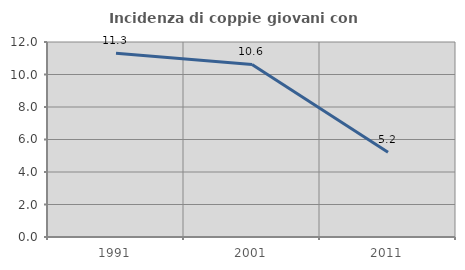
| Category | Incidenza di coppie giovani con figli |
|---|---|
| 1991.0 | 11.304 |
| 2001.0 | 10.619 |
| 2011.0 | 5.213 |